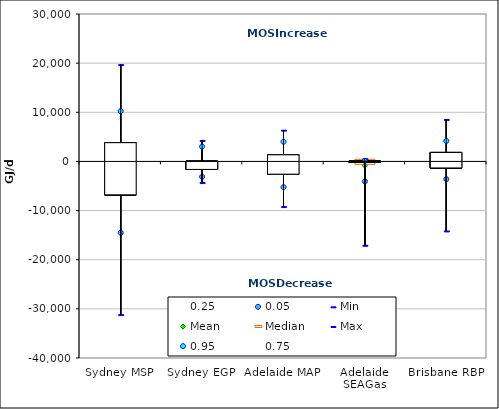
| Category | 0.25 | 0.05 | Min | Mean | Median | Max | 0.95 | 0.75 |
|---|---|---|---|---|---|---|---|---|
| Sydney MSP | -6800 | -14501.5 | -31169 | -2029.581 | -1913 | 19702 | 10233.5 | 3816 |
| Sydney EGP | -1626.94 | -3131.531 | -4299.391 | -599.045 | -890.821 | 4276.733 | 3019.537 | 38.818 |
| Adelaide MAP | -2595.5 | -5237.5 | -9182 | -731.323 | -514 | 6361 | 4020.5 | 1347 |
| Adelaide SEAGas | -7 | -4072 | -17065 | -893.645 | 18 | 564 | 116 | 57.5 |
| Brisbane RBP | -1326 | -3604 | -14142 | 46.161 | 370 | 8538 | 4171.5 | 1825.5 |